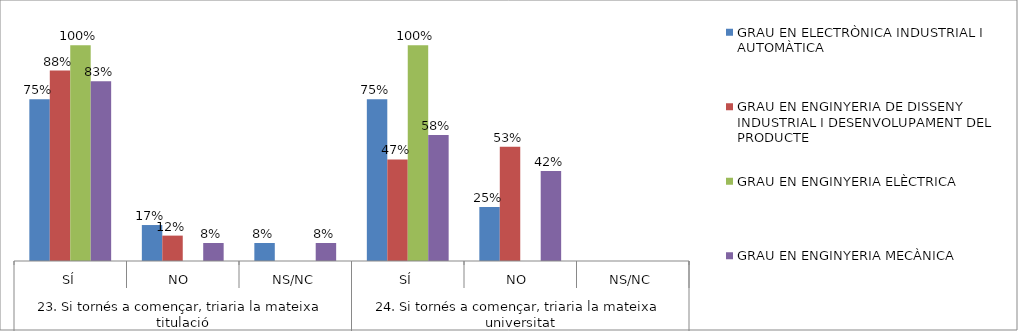
| Category | GRAU EN ELECTRÒNICA INDUSTRIAL I AUTOMÀTICA | GRAU EN ENGINYERIA DE DISSENY INDUSTRIAL I DESENVOLUPAMENT DEL PRODUCTE | GRAU EN ENGINYERIA ELÈCTRICA | GRAU EN ENGINYERIA MECÀNICA |
|---|---|---|---|---|
| 0 | 0.75 | 0.882 | 1 | 0.833 |
| 1 | 0.167 | 0.118 | 0 | 0.083 |
| 2 | 0.083 | 0 | 0 | 0.083 |
| 3 | 0.75 | 0.471 | 1 | 0.583 |
| 4 | 0.25 | 0.529 | 0 | 0.417 |
| 5 | 0 | 0 | 0 | 0 |